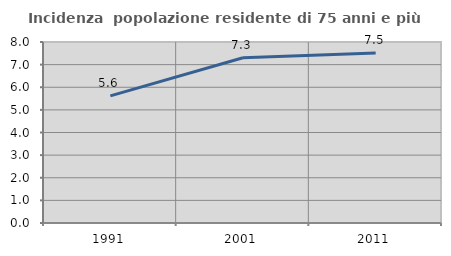
| Category | Incidenza  popolazione residente di 75 anni e più |
|---|---|
| 1991.0 | 5.618 |
| 2001.0 | 7.306 |
| 2011.0 | 7.516 |